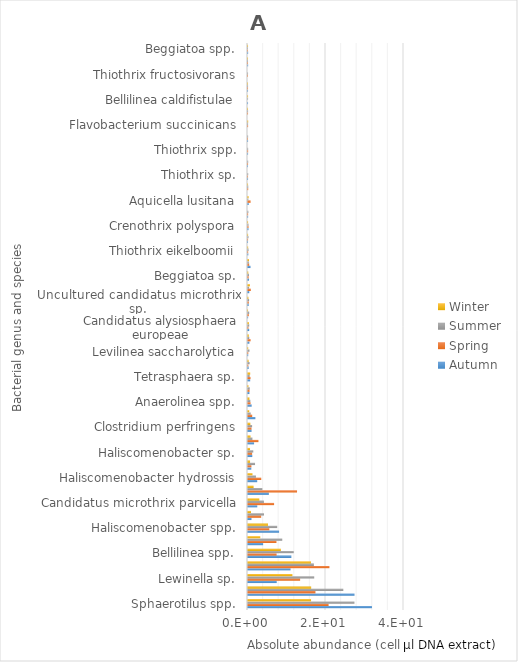
| Category | Autumn | Spring | Summer | Winter |
|---|---|---|---|---|
| Sphaerotilus spp. | 31.786 | 20.668 | 27.298 | 16.17 |
| Lewinella spp. | 27.314 | 17.297 | 24.44 | 16.202 |
| Lewinella sp. | 7.365 | 13.366 | 16.983 | 11.392 |
| Tetrasphaera spp. | 10.914 | 20.881 | 16.891 | 16.148 |
| Bellilinea spp. | 11.121 | 7.334 | 11.735 | 8.425 |
| Mycobacterium spp. | 3.879 | 7.298 | 8.787 | 3.15 |
| Haliscomenobacter spp. | 7.974 | 5.465 | 7.489 | 5.126 |
| Candidatus monilibacter batavus | 0.897 | 3.38 | 4.108 | 0.774 |
| Candidatus microthrix parvicella | 2.379 | 6.693 | 4.083 | 2.908 |
| Crocinitomix spp. | 5.352 | 12.576 | 3.69 | 1.438 |
| Haliscomenobacter hydrossis | 2.364 | 3.403 | 2.039 | 1.152 |
| Levilinea spp. | 0.848 | 0.877 | 1.804 | 0.531 |
| Haliscomenobacter sp. | 1.1 | 1.053 | 1.355 | 0.524 |
| Fluviicola spp. | 1.559 | 2.679 | 1.137 | 0.651 |
| Clostridium perfringens | 0.914 | 0.897 | 1.055 | 0.611 |
| Flavobacterium gelidilacus | 1.893 | 1.082 | 0.695 | 0.325 |
| Anaerolinea spp. | 0.944 | 0.661 | 0.608 | 0.369 |
| Longilinea spp. | 0.369 | 0.399 | 0.451 | 0.108 |
| Tetrasphaera sp. | 0.562 | 0.647 | 0.438 | 0.567 |
| Tetrasphaera jenkinsii | 0.167 | 0.088 | 0.416 | 0.161 |
| Levilinea saccharolytica | 0.058 | 0.071 | 0.381 | 0.054 |
| Kouleothrix aurantiaca | 0.361 | 0.669 | 0.323 | 0.21 |
| Candidatus alysiosphaera europeae | 0.308 | 0.118 | 0.312 | 0.216 |
| Aquicella spp. | 0.033 | 0.196 | 0.312 | 0.014 |
| Uncultured candidatus microthrix sp. | 0.169 | 0.198 | 0.282 | 0.115 |
| Acinetobacter johnsonii | 0.331 | 0.718 | 0.28 | 0.489 |
| Beggiatoa sp. | 0.266 | 0.157 | 0.247 | 0.076 |
| Anaerolinea thermolimosa | 0.647 | 0.305 | 0.207 | 0.237 |
| Thiothrix eikelboomii | 0.081 | 0.043 | 0.132 | 0.041 |
| Leptolinea tardivitalis | 0.009 | 0.022 | 0.126 | 0.027 |
| Crenothrix polyspora | 0.124 | 0.13 | 0.125 | 0.023 |
| Kouleothrix spp. | 0.031 | 0.03 | 0.093 | 0 |
| Aquicella lusitana | 0.184 | 0.668 | 0.093 | 0.151 |
| Gordonia paraffinivorans | 0 | 0.054 | 0.061 | 0.012 |
| Thiothrix sp. | 0.015 | 0.01 | 0.052 | 0 |
| Leptolinea spp. | 0.004 | 0.018 | 0.046 | 0 |
| Thiothrix spp. | 0.019 | 0.035 | 0.036 | 0 |
| Tetrasphaera vanveenii | 0.019 | 0.008 | 0.028 | 0 |
| Flavobacterium succinicans | 0 | 0.026 | 0.022 | 0.05 |
| Thiothrix disciformis | 0 | 0.014 | 0.019 | 0.008 |
| Bellilinea caldifistulae | 0.011 | 0 | 0.017 | 0.015 |
| Tetrasphaera australiensis | 0.011 | 0.01 | 0.012 | 0.006 |
| Thiothrix fructosivorans | 0 | 0.003 | 0.011 | 0 |
| Candidatus microthrix calida | 0.037 | 0.008 | 0.006 | 0.006 |
| Beggiatoa spp. | 0.032 | 0.005 | 0.003 | 0.009 |